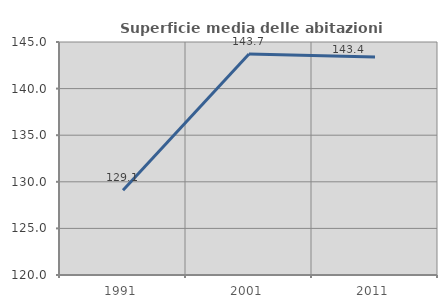
| Category | Superficie media delle abitazioni occupate |
|---|---|
| 1991.0 | 129.088 |
| 2001.0 | 143.704 |
| 2011.0 | 143.384 |